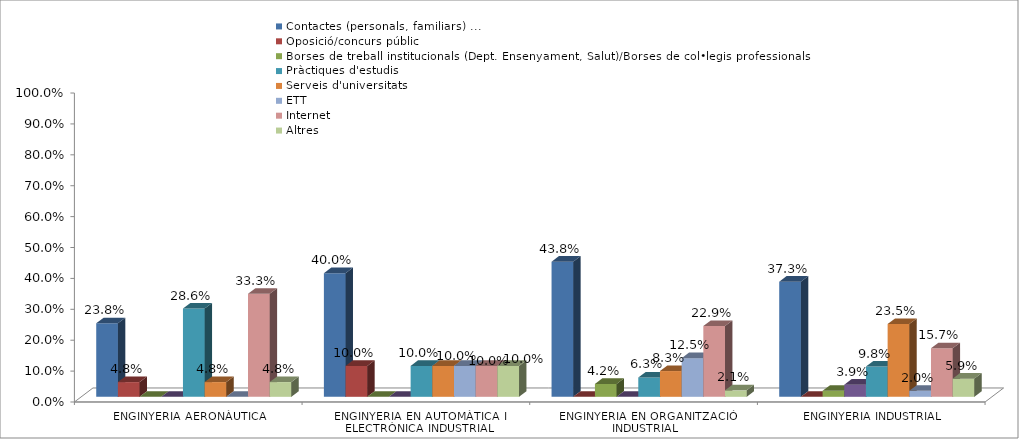
| Category | Contactes (personals, familiars) ... | Oposició/concurs públic | Borses de treball institucionals (Dept. Ensenyament, Salut)/Borses de col•legis professionals | Creació pròpia empresa/despatx | Pràctiques d'estudis | Serveis d'universitats | ETT | Internet | Altres |
|---|---|---|---|---|---|---|---|---|---|
| ENGINYERIA AERONÀUTICA | 0.238 | 0.048 | 0 | 0 | 0.286 | 0.048 | 0 | 0.333 | 0.048 |
| ENGINYERIA EN AUTOMÀTICA I ELECTRÒNICA INDUSTRIAL | 0.4 | 0.1 | 0 | 0 | 0.1 | 0.1 | 0.1 | 0.1 | 0.1 |
| ENGINYERIA EN ORGANITZACIÓ INDUSTRIAL | 0.438 | 0 | 0.042 | 0 | 0.062 | 0.083 | 0.125 | 0.229 | 0.021 |
| ENGINYERIA INDUSTRIAL | 0.373 | 0 | 0.02 | 0.039 | 0.098 | 0.235 | 0.02 | 0.157 | 0.059 |